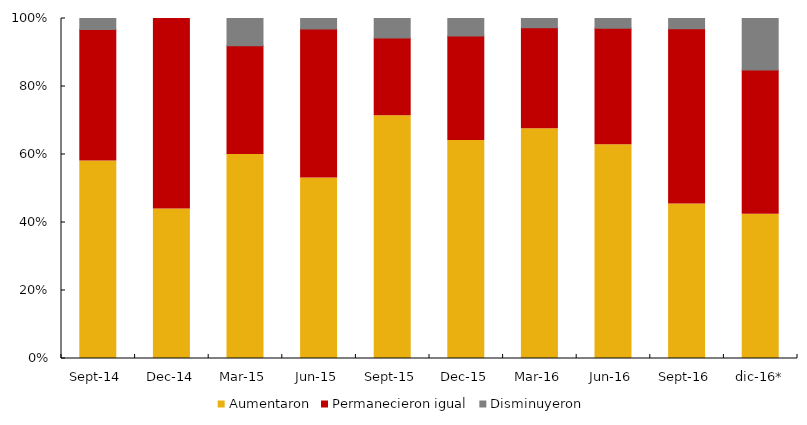
| Category | Aumentaron | Permanecieron igual | Disminuyeron |
|---|---|---|---|
| sep-14 | 58.065 | 38.7 | 3.226 |
| dic-14 | 44 | 56 | 0 |
| mar-15 | 60 | 32 | 8 |
| jun-15 | 53.1 | 43.8 | 3.1 |
| sep-15 | 71.4 | 22.9 | 5.7 |
| dic-15 | 64.103 | 30.769 | 5.128 |
| mar-16 | 67.568 | 29.73 | 2.703 |
| jun-16 | 62.857 | 34.286 | 2.857 |
| sep-16 | 45.455 | 51.515 | 3.03 |
| dic-16* | 42.424 | 42.424 | 15.152 |